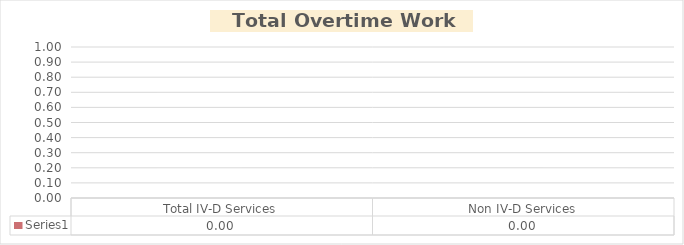
| Category | Series 0 |
|---|---|
| Total IV-D Services | 0 |
| Non IV-D Services | 0 |